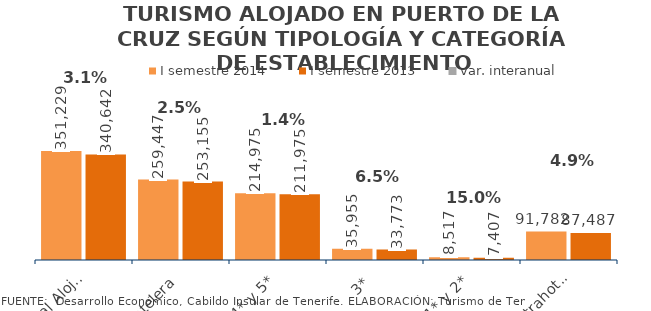
| Category | I semestre 2014 | I semestre 2013 |
|---|---|---|
| Total Alojados | 351229 | 340642 |
| Hotelera | 259447 | 253155 |
| 4* y 5* | 214975 | 211975 |
| 3* | 35955 | 33773 |
| 1* y 2* | 8517 | 7407 |
| Extrahotelera | 91782 | 87487 |